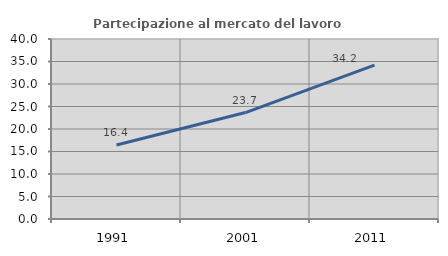
| Category | Partecipazione al mercato del lavoro  femminile |
|---|---|
| 1991.0 | 16.429 |
| 2001.0 | 23.656 |
| 2011.0 | 34.177 |